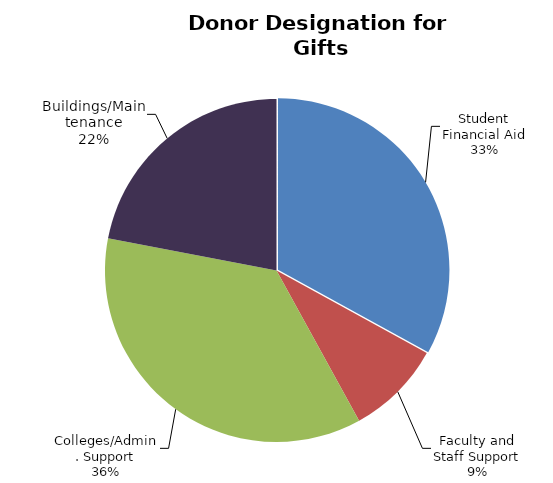
| Category | Series 0 |
|---|---|
| Student Financial Aid | 0.33 |
| Faculty and Staff Support | 0.09 |
| Colleges/Admin. Support | 0.36 |
| Buildings/Maintenance | 0.22 |